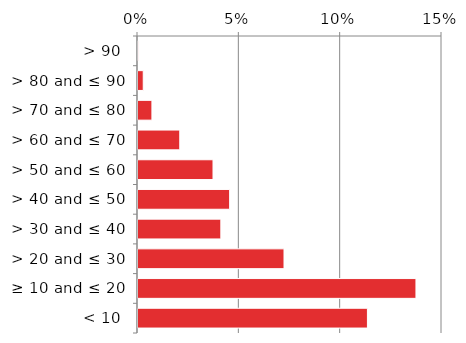
| Category | Native |
|---|---|
| < 10 | 0.114 |
| ≥ 10 and ≤ 20 | 0.138 |
| > 20 and ≤ 30 | 0.073 |
| > 30 and ≤ 40 | 0.041 |
| > 40 and ≤ 50 | 0.046 |
| > 50 and ≤ 60 | 0.038 |
| > 60 and ≤ 70 | 0.021 |
| > 70 and ≤ 80 | 0.007 |
| > 80 and ≤ 90 | 0.003 |
| > 90 | 0.001 |